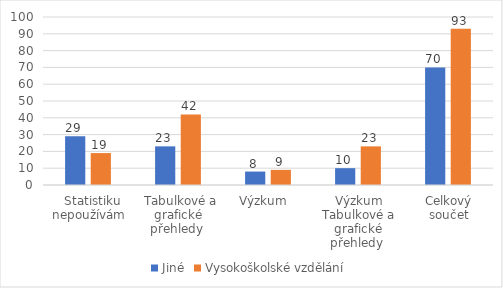
| Category | Jiné | Vysokoškolské vzdělání |
|---|---|---|
|   Statistiku nepoužívám | 29 | 19 |
|  Tabulkové a grafické přehledy  | 23 | 42 |
| Výzkum   | 8 | 9 |
| Výzkum Tabulkové a grafické přehledy  | 10 | 23 |
| Celkový součet | 70 | 93 |